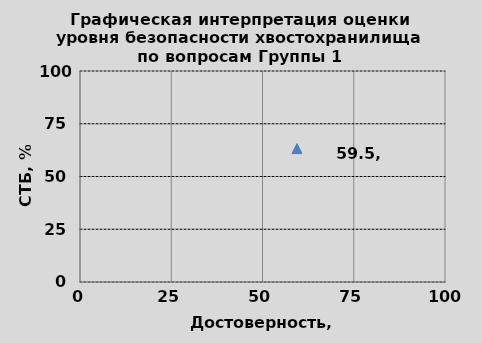
| Category | B1 |
|---|---|
| 59.45945945945946 | 63.235 |